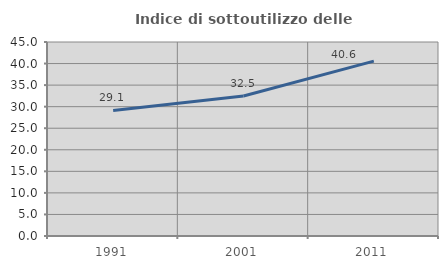
| Category | Indice di sottoutilizzo delle abitazioni  |
|---|---|
| 1991.0 | 29.131 |
| 2001.0 | 32.472 |
| 2011.0 | 40.565 |